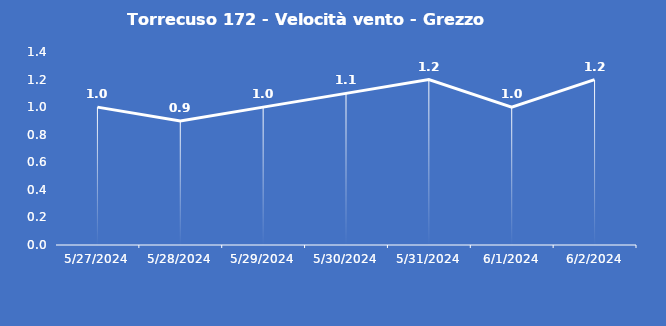
| Category | Torrecuso 172 - Velocità vento - Grezzo (m/s) |
|---|---|
| 5/27/24 | 1 |
| 5/28/24 | 0.9 |
| 5/29/24 | 1 |
| 5/30/24 | 1.1 |
| 5/31/24 | 1.2 |
| 6/1/24 | 1 |
| 6/2/24 | 1.2 |